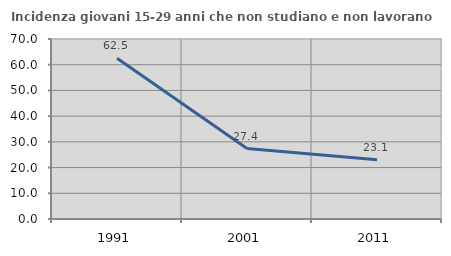
| Category | Incidenza giovani 15-29 anni che non studiano e non lavorano  |
|---|---|
| 1991.0 | 62.509 |
| 2001.0 | 27.397 |
| 2011.0 | 23.077 |